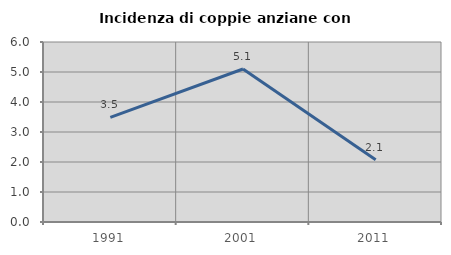
| Category | Incidenza di coppie anziane con figli |
|---|---|
| 1991.0 | 3.488 |
| 2001.0 | 5.1 |
| 2011.0 | 2.078 |